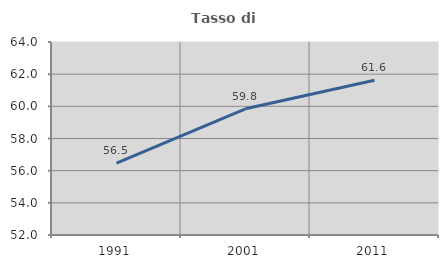
| Category | Tasso di occupazione   |
|---|---|
| 1991.0 | 56.472 |
| 2001.0 | 59.846 |
| 2011.0 | 61.627 |